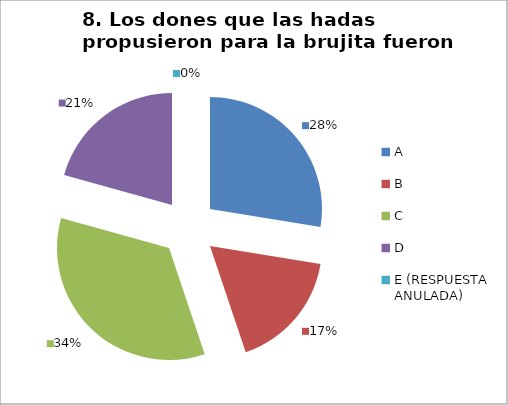
| Category | CANTIDAD DE RESPUESTAS PREGUNTA (8) | PORCENTAJE |
|---|---|---|
| A | 8 | 0.276 |
| B | 5 | 0.172 |
| C | 10 | 0.345 |
| D | 6 | 0.207 |
| E (RESPUESTA ANULADA) | 0 | 0 |